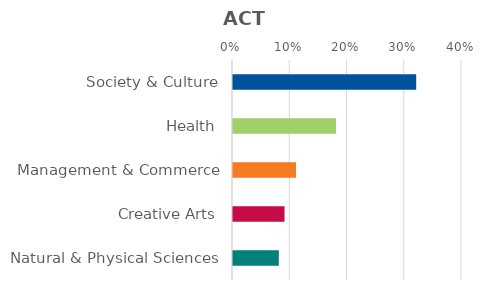
| Category | Series 0 |
|---|---|
| Society & Culture | 0.32 |
| Health | 0.18 |
| Management & Commerce | 0.11 |
| Creative Arts | 0.09 |
| Natural & Physical Sciences | 0.08 |